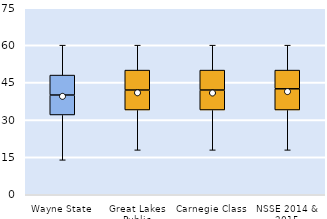
| Category | 25th | 50th | 75th |
|---|---|---|---|
| Wayne State | 32 | 8 | 8 |
| Great Lakes Public | 34 | 8 | 8 |
| Carnegie Class | 34 | 8 | 8 |
| NSSE 2014 & 2015 | 34 | 8.5 | 7.5 |